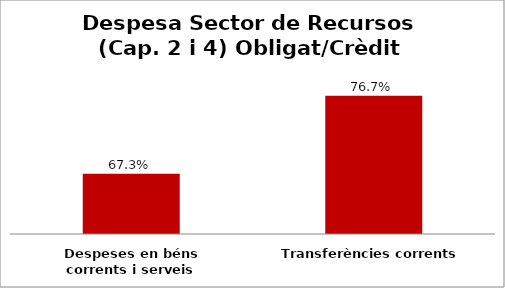
| Category | Series 0 |
|---|---|
| Despeses en béns corrents i serveis | 0.673 |
| Transferències corrents | 0.767 |